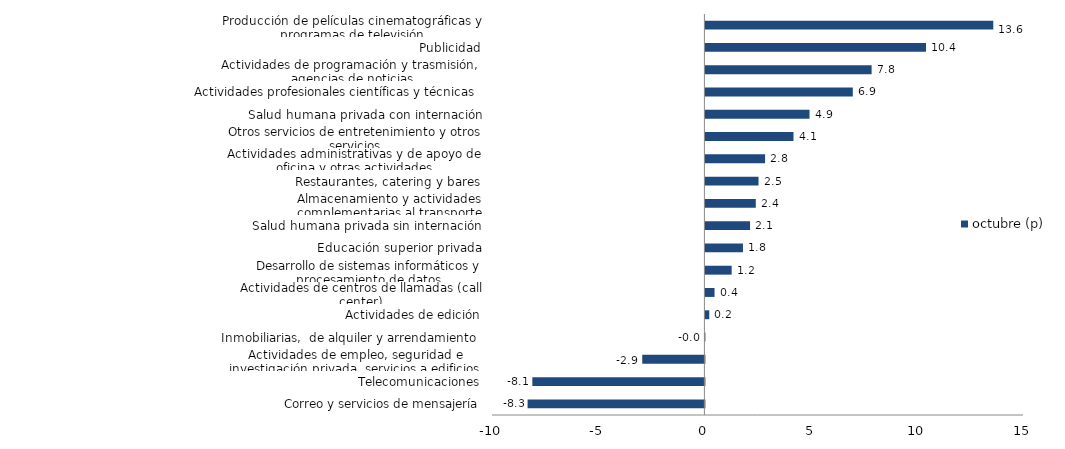
| Category | octubre (p) |
|---|---|
| Correo y servicios de mensajería | -8.325 |
| Telecomunicaciones | -8.1 |
| Actividades de empleo, seguridad e investigación privada, servicios a edificios | -2.926 |
| Inmobiliarias,  de alquiler y arrendamiento  | -0.003 |
| Actividades de edición | 0.182 |
| Actividades de centros de llamadas (call center) | 0.43 |
| Desarrollo de sistemas informáticos y procesamiento de datos | 1.236 |
| Educación superior privada | 1.768 |
| Salud humana privada sin internación | 2.103 |
| Almacenamiento y actividades complementarias al transporte | 2.373 |
| Restaurantes, catering y bares | 2.501 |
| Actividades administrativas y de apoyo de oficina y otras actividades | 2.81 |
| Otros servicios de entretenimiento y otros servicios | 4.148 |
| Salud humana privada con internación | 4.902 |
| Actividades profesionales científicas y técnicas  | 6.94 |
| Actividades de programación y trasmisión,  agencias de noticias | 7.826 |
| Publicidad | 10.387 |
| Producción de películas cinematográficas y programas de televisión | 13.555 |